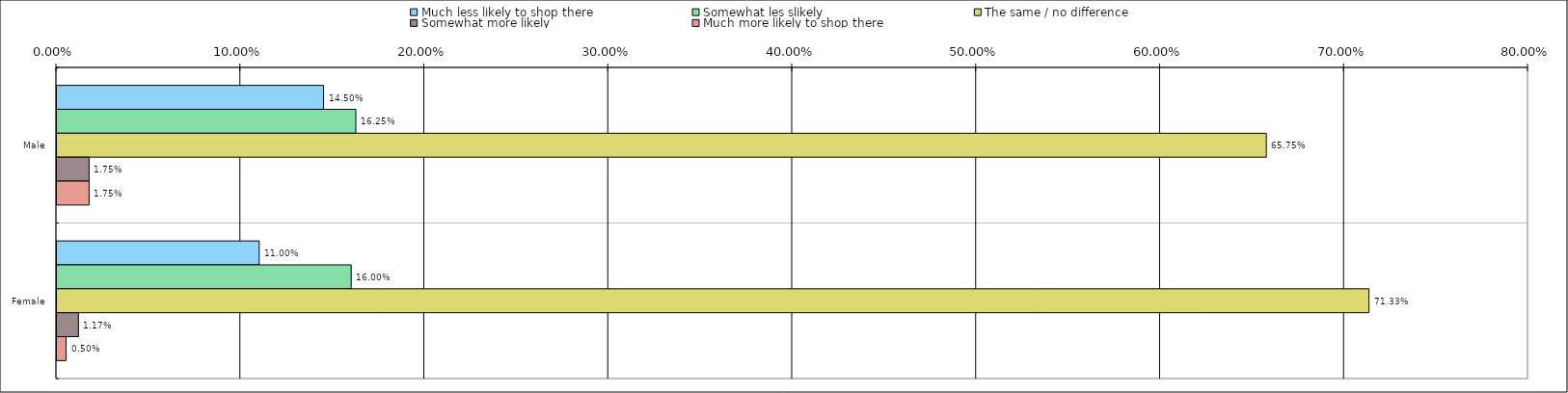
| Category | Much less likely to shop there | Somewhat les slikely | The same / no difference | Somewhat more likely | Much more likely to shop there |
|---|---|---|---|---|---|
| 0 | 0.145 | 0.162 | 0.658 | 0.018 | 0.018 |
| 1 | 0.11 | 0.16 | 0.713 | 0.012 | 0.005 |